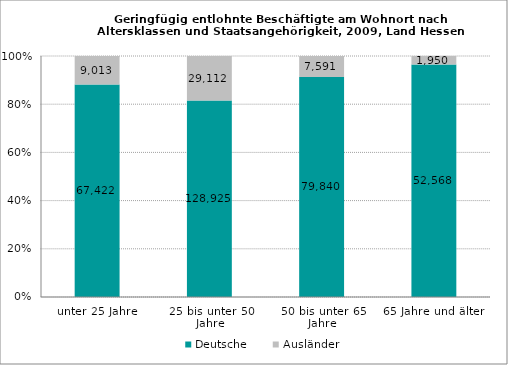
| Category | Deutsche | Ausländer |
|---|---|---|
| unter 25 Jahre | 67422 | 9013 |
| 25 bis unter 50 Jahre | 128925 | 29112 |
| 50 bis unter 65 Jahre | 79840 | 7591 |
| 65 Jahre und älter | 52568 | 1950 |